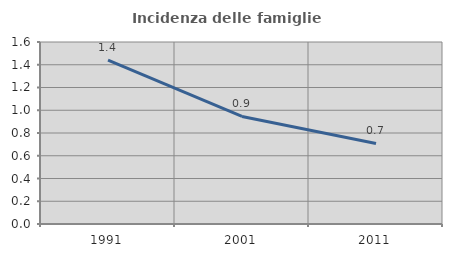
| Category | Incidenza delle famiglie numerose |
|---|---|
| 1991.0 | 1.441 |
| 2001.0 | 0.945 |
| 2011.0 | 0.708 |